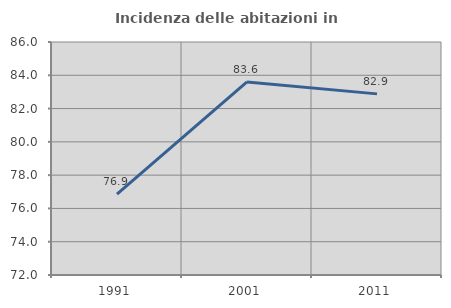
| Category | Incidenza delle abitazioni in proprietà  |
|---|---|
| 1991.0 | 76.863 |
| 2001.0 | 83.599 |
| 2011.0 | 82.883 |